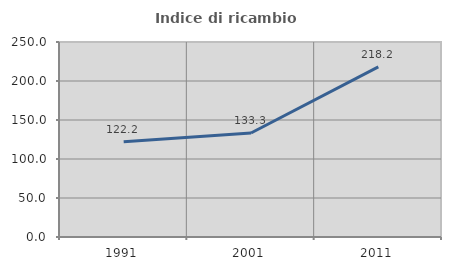
| Category | Indice di ricambio occupazionale  |
|---|---|
| 1991.0 | 122.222 |
| 2001.0 | 133.333 |
| 2011.0 | 218.182 |